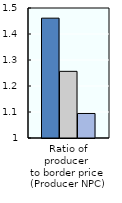
| Category | 1986-88 | 2000-02 | 2018-20 |
|---|---|---|---|
| Ratio of producer 
to border price 
(Producer NPC) | 1.461 | 1.256 | 1.094 |